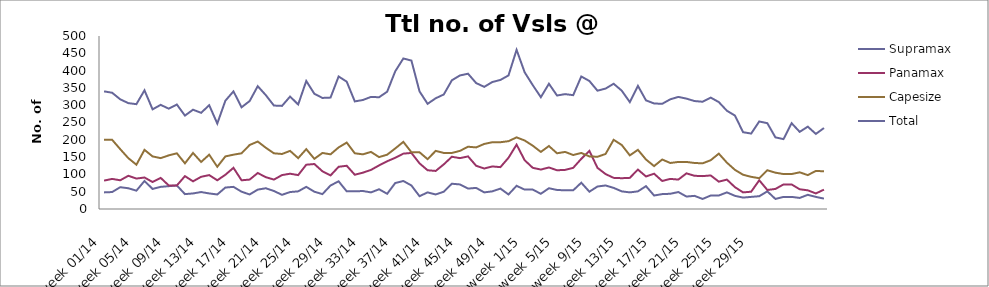
| Category | Supramax | Panamax | Capesize | Total |
|---|---|---|---|---|
| week 01/14 | 48 | 82 | 200 | 340 |
| week 02/14 | 49 | 87 | 200 | 336 |
| week 03/14 | 63 | 83 | 173 | 317 |
| week 04/14 | 60 | 96 | 147 | 306 |
| week 05/14 | 53 | 88 | 128 | 303 |
| week 06/14 | 81 | 91 | 171 | 343 |
| week 07/14 | 58 | 78 | 152 | 288 |
| week 08/14 | 64 | 90 | 147 | 301 |
| week 09/14 | 66 | 68 | 155 | 290 |
| week 10/14 | 68 | 68 | 161 | 302 |
| week 11/14 | 43 | 95 | 132 | 270 |
| week 12/14 | 45 | 80 | 162 | 287 |
| week 13/14 | 49 | 93 | 136 | 278 |
| week 14/14 | 45 | 98 | 157 | 300 |
| week 15/14 | 42 | 83 | 122 | 247 |
| week 16/14 | 62 | 99 | 152 | 313 |
| week 17/14 | 64 | 119 | 157 | 340 |
| week 18/14 | 50 | 83 | 161 | 294 |
| week 19/14 | 42 | 85 | 185 | 312 |
| week 20/14 | 56 | 104 | 195 | 355 |
| week 21/14 | 60 | 92 | 177 | 329 |
| week 22/14 | 52 | 85 | 161 | 299 |
| week 23/14 | 41 | 98 | 159 | 298 |
| week 24/14 | 49 | 102 | 168 | 325 |
| week 25/14 | 51 | 98 | 147 | 302 |
| week 26/14 | 64 | 128 | 173 | 370 |
| week 27/14 | 50 | 130 | 145 | 333 |
| week 28/14 | 43 | 109 | 162 | 321 |
| week 29/14 | 68 | 97 | 158 | 322 |
| week 30/14 | 80 | 122 | 178 | 383 |
| week 31/14 | 51 | 125 | 192 | 368 |
| week 32/14 | 51 | 99 | 161 | 311 |
| week 33/14 | 52 | 105 | 158 | 315 |
| week 34/14 | 48 | 113 | 165 | 324 |
| week 35/14 | 57 | 126 | 150 | 323 |
| week 36/14 | 44 | 138 | 157 | 339 |
| week 37/14 | 75 | 148 | 175 | 398 |
| week 38/14 | 81 | 160 | 194 | 435 |
| week 39/14 | 68 | 162 | 164 | 429 |
| week 40/14 | 37 | 132 | 164 | 340 |
| week 41/14 | 48 | 112 | 144 | 304 |
| week 42/14 | 42 | 110 | 168 | 320 |
| week 43/14 | 50 | 129 | 162 | 331 |
| week 44/14 | 73 | 151 | 162 | 372 |
| week 45/14 | 71 | 147 | 168 | 386 |
| week 46/14 | 59 | 152 | 180 | 391 |
| week 47/14 | 61 | 125 | 178 | 364 |
| week 48/14 | 48 | 117 | 188 | 353 |
| week 49/14 | 51 | 123 | 193 | 367 |
| week 50/14 | 59 | 121 | 193 | 373 |
| week 51/14 | 42 | 148 | 196 | 386 |
| week 52/14 | 67 | 186 | 207 | 460 |
| week 1/15 | 56 | 141 | 198 | 395 |
| week 2/15 | 56 | 119 | 183 | 358 |
| week 3/15 | 44 | 114 | 165 | 323 |
| week 4/15 | 60 | 120 | 182 | 362 |
| week 5/15 | 55 | 112 | 161 | 328 |
| week 6/15 | 54 | 113 | 165 | 332 |
| week 7/15 | 54 | 119 | 156 | 329 |
| week 8/15 | 76 | 145 | 162 | 383 |
| week 9/15 | 50 | 168 | 152 | 370 |
| week 10/15 | 65 | 119 | 151 | 342 |
| week 11/15 | 68 | 101 | 159 | 348 |
| week 12/15 | 61 | 90 | 200 | 362 |
| week 13/15 | 51 | 89 | 185 | 342 |
| week 14/15 | 48 | 90 | 155 | 309 |
| week 15/15 | 51 | 114 | 171 | 356 |
| week 16/15 | 66 | 94 | 143 | 314 |
| week 17/15 | 39 | 102 | 124 | 305 |
| week 18/15 | 43 | 81 | 143 | 304 |
| week 19/15 | 44 | 87 | 133 | 317 |
| week 20/15 | 49 | 85 | 136 | 324 |
| week 21/15 | 36 | 103 | 136 | 319 |
| week 22/15 | 38 | 96 | 133 | 312 |
| week 23/15 | 29 | 95 | 132 | 310 |
| week 24/15 | 39 | 97 | 141 | 322 |
| week 25/15 | 39 | 79 | 160 | 309 |
| week 26/15 | 48 | 85 | 134 | 284 |
| week 27/15 | 38 | 63 | 113 | 270 |
| week 28/15 | 33 | 48 | 99 | 222 |
| week 29/15 | 35 | 50 | 93 | 218 |
| week 30/15 | 37 | 83 | 89 | 253 |
| week 31/15 | 51 | 55 | 112 | 248 |